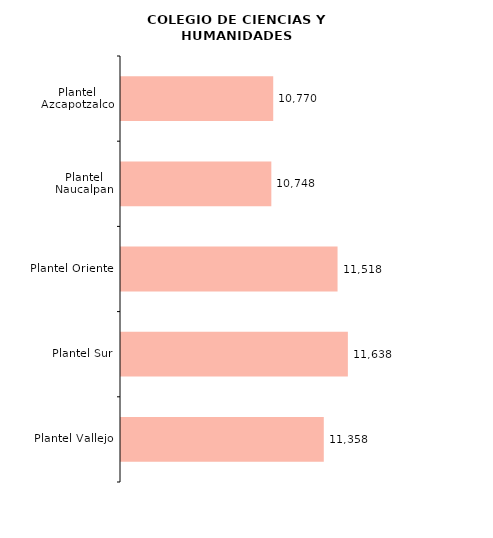
| Category | Series 0 |
|---|---|
| Plantel Vallejo | 11358 |
| Plantel Sur | 11638 |
| Plantel Oriente | 11518 |
| Plantel Naucalpan | 10748 |
| Plantel Azcapotzalco | 10770 |